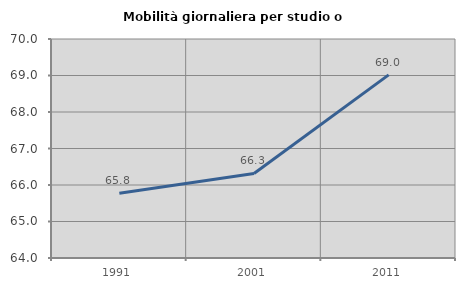
| Category | Mobilità giornaliera per studio o lavoro |
|---|---|
| 1991.0 | 65.773 |
| 2001.0 | 66.316 |
| 2011.0 | 69.018 |